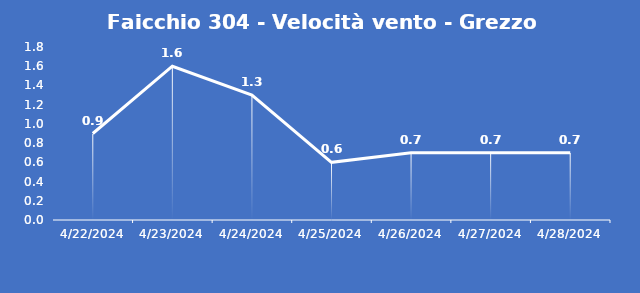
| Category | Faicchio 304 - Velocità vento - Grezzo (m/s) |
|---|---|
| 4/22/24 | 0.9 |
| 4/23/24 | 1.6 |
| 4/24/24 | 1.3 |
| 4/25/24 | 0.6 |
| 4/26/24 | 0.7 |
| 4/27/24 | 0.7 |
| 4/28/24 | 0.7 |